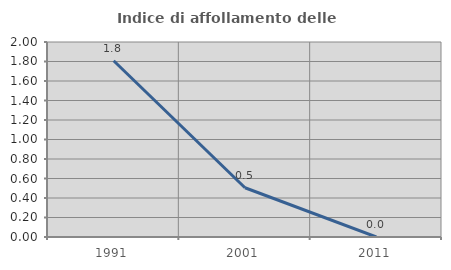
| Category | Indice di affollamento delle abitazioni  |
|---|---|
| 1991.0 | 1.807 |
| 2001.0 | 0.505 |
| 2011.0 | 0 |